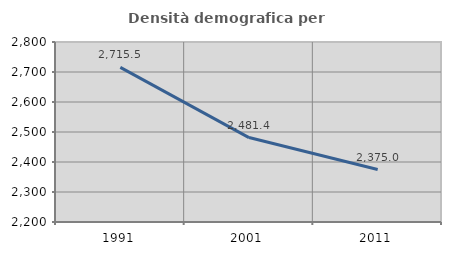
| Category | Densità demografica |
|---|---|
| 1991.0 | 2715.466 |
| 2001.0 | 2481.449 |
| 2011.0 | 2374.981 |